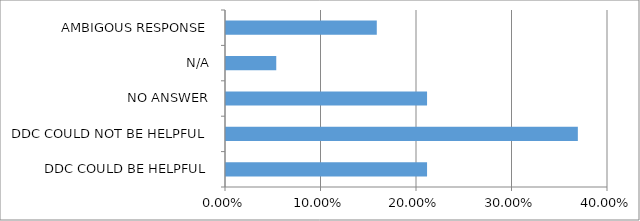
| Category | Series 0 |
|---|---|
| DDC COULD BE HELPFUL | 0.211 |
| DDC COULD NOT BE HELPFUL | 0.368 |
| NO ANSWER | 0.211 |
| N/A | 0.053 |
| AMBIGOUS RESPONSE | 0.158 |